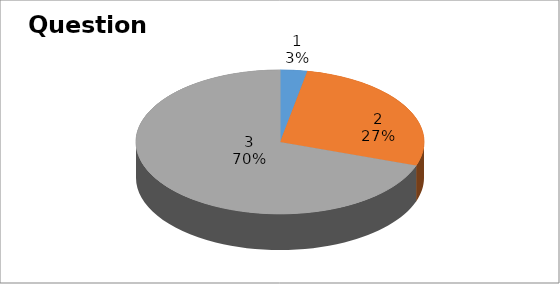
| Category | Series 0 |
|---|---|
| 0 | 1 |
| 1 | 9 |
| 2 | 23 |